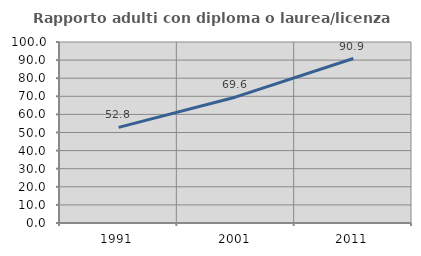
| Category | Rapporto adulti con diploma o laurea/licenza media  |
|---|---|
| 1991.0 | 52.835 |
| 2001.0 | 69.648 |
| 2011.0 | 90.862 |